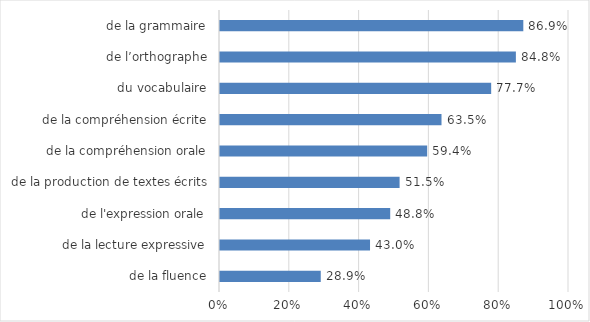
| Category | Series 0 |
|---|---|
| de la fluence | 0.289 |
| de la lecture expressive | 0.43 |
| de l'expression orale | 0.488 |
| de la production de textes écrits | 0.515 |
| de la compréhension orale | 0.594 |
| de la compréhension écrite | 0.635 |
| du vocabulaire | 0.777 |
| de l’orthographe | 0.848 |
| de la grammaire | 0.869 |